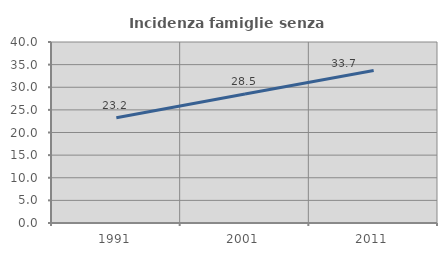
| Category | Incidenza famiglie senza nuclei |
|---|---|
| 1991.0 | 23.25 |
| 2001.0 | 28.527 |
| 2011.0 | 33.695 |